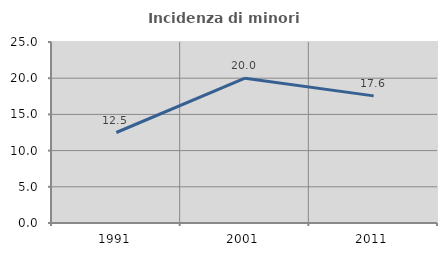
| Category | Incidenza di minori stranieri |
|---|---|
| 1991.0 | 12.5 |
| 2001.0 | 20 |
| 2011.0 | 17.557 |